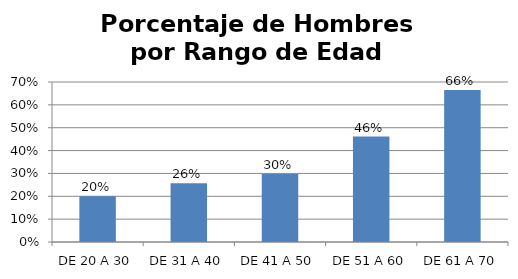
| Category | Porcentaje |
|---|---|
| DE 20 A 30 | 0.2 |
| DE 31 A 40 | 0.257 |
| DE 41 A 50 | 0.298 |
| DE 51 A 60 | 0.462 |
| DE 61 A 70 | 0.665 |